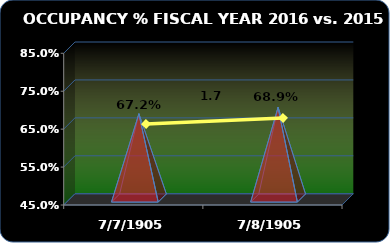
| Category | Occupancy % |
|---|---|
| 2016.0 | 0.689 |
| 2015.0 | 0.672 |